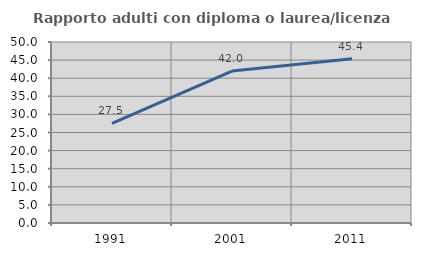
| Category | Rapporto adulti con diploma o laurea/licenza media  |
|---|---|
| 1991.0 | 27.5 |
| 2001.0 | 41.964 |
| 2011.0 | 45.353 |